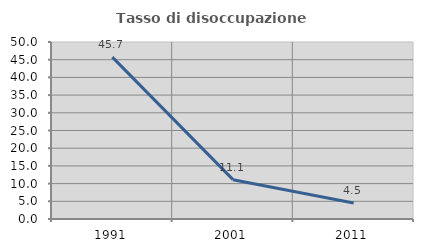
| Category | Tasso di disoccupazione giovanile  |
|---|---|
| 1991.0 | 45.714 |
| 2001.0 | 11.111 |
| 2011.0 | 4.545 |